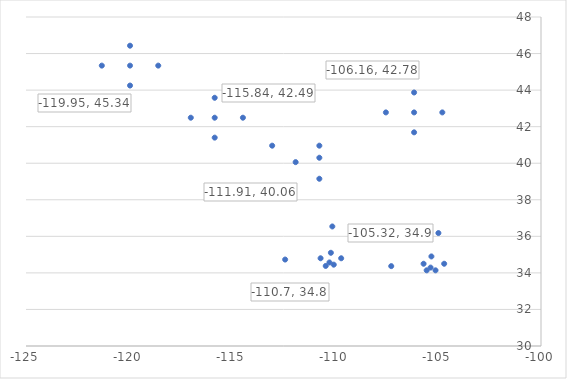
| Category | Series 0 |
|---|---|
| -110.45 | 34.38 |
| -105.36 | 34.29 |
| -115.84 | 42.49 |
| -110.76 | 40.96 |
| -119.95 | 45.34 |
| -106.16 | 42.78 |
| -110.27 | 34.57 |
| -105.12 | 34.14 |
| -117.0 | 42.49 |
| -113.05 | 40.96 |
| -121.32 | 45.34 |
| -107.53 | 42.78 |
| -110.06 | 34.45 |
| -105.55 | 34.14 |
| -115.84 | 41.4 |
| -110.76 | 40.3 |
| -118.58 | 45.34 |
| -104.79 | 42.78 |
| -109.7 | 34.8 |
| -105.32 | 34.9 |
| -114.47 | 42.49 |
| -111.91 | 40.06 |
| -119.95 | 46.43 |
| -106.16 | 43.87 |
| -110.7 | 34.8 |
| -105.7 | 34.5 |
| -115.84 | 43.58 |
| -110.76 | 39.15 |
| -119.95 | 44.25 |
| -106.16 | 41.69 |
| -110.2 | 35.1 |
| -104.7 | 34.5 |
| -110.13 | 36.54 |
| -107.27 | 34.37 |
| -112.42 | 34.73 |
| -104.98 | 36.18 |